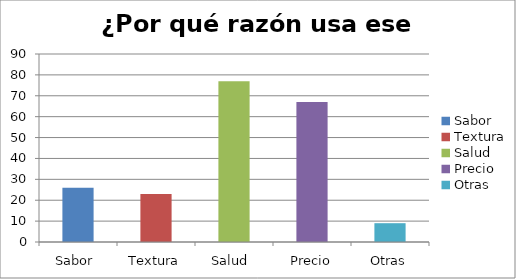
| Category | ¿Por qué razón usa ese aceite? |
|---|---|
| Sabor  | 26 |
| Textura | 23 |
| Salud  | 77 |
| Precio | 67 |
| Otras | 9 |